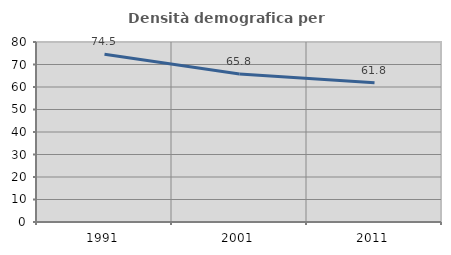
| Category | Densità demografica |
|---|---|
| 1991.0 | 74.548 |
| 2001.0 | 65.822 |
| 2011.0 | 61.836 |